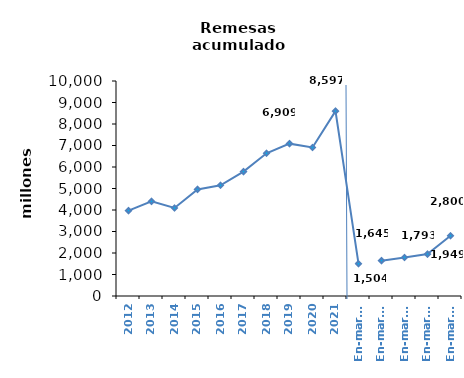
| Category | Series 0 |
|---|---|
| 2012 | 3969.69 |
| 2013 | 4401.04 |
| 2014 | 4093.21 |
| 2015 | 4957.39 |
| 2016 | 5147.47 |
| 2017 | 5783.73 |
| 2018 | 6636.2 |
| 2019 | 7086.53 |
| 2020 | 6908.85 |
| 2021 | 8597.25 |
| En-mar.18 | 1503.77 |
| En-mar.19 | 1644.7 |
| En-mar.20 | 1792.93 |
| En-mar.21 | 1949.01 |
| En-mar.22 | 2800.49 |